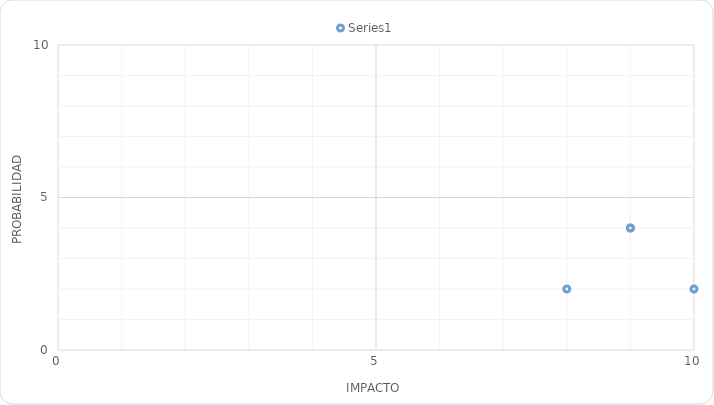
| Category | Series 0 |
|---|---|
| 9.0 | 4 |
| 9.0 | 4 |
| 10.0 | 2 |
| 8.0 | 2 |